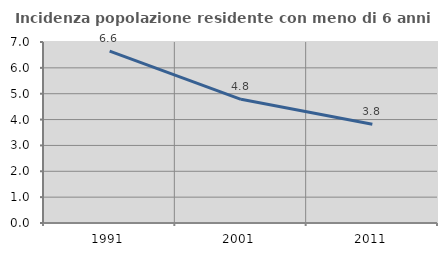
| Category | Incidenza popolazione residente con meno di 6 anni |
|---|---|
| 1991.0 | 6.647 |
| 2001.0 | 4.782 |
| 2011.0 | 3.82 |